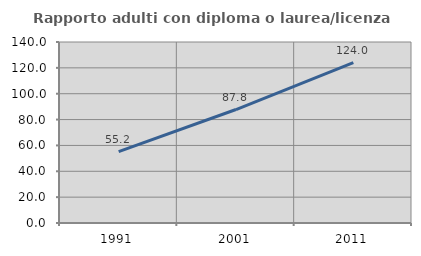
| Category | Rapporto adulti con diploma o laurea/licenza media  |
|---|---|
| 1991.0 | 55.189 |
| 2001.0 | 87.77 |
| 2011.0 | 124.026 |